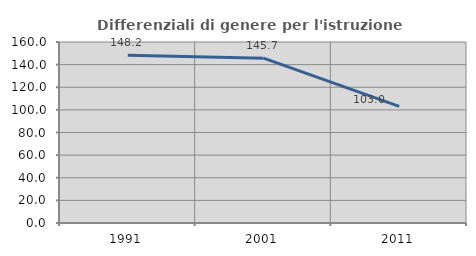
| Category | Differenziali di genere per l'istruzione superiore |
|---|---|
| 1991.0 | 148.216 |
| 2001.0 | 145.714 |
| 2011.0 | 103.019 |